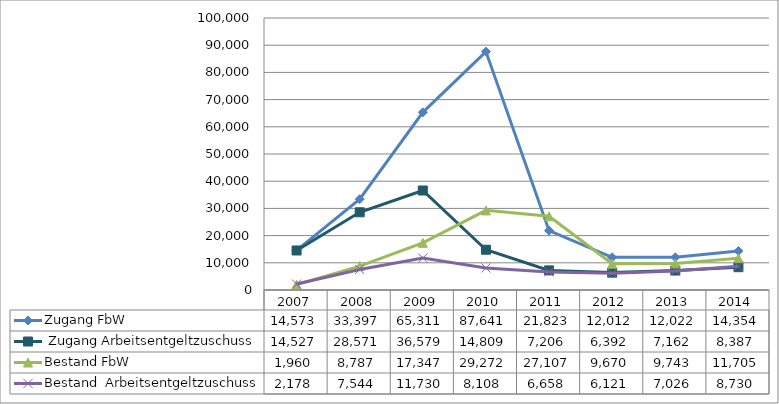
| Category | Zugang FbW |  Zugang Arbeitsentgeltzuschuss | Bestand FbW | Bestand  Arbeitsentgeltzuschuss |
|---|---|---|---|---|
| 2007.0 | 14573 | 14527 | 1960 | 2178 |
| 2008.0 | 33397 | 28571 | 8787 | 7544 |
| 2009.0 | 65311 | 36579 | 17347 | 11730 |
| 2010.0 | 87641 | 14809 | 29272 | 8108 |
| 2011.0 | 21823 | 7206 | 27107 | 6658 |
| 2012.0 | 12012 | 6392 | 9670 | 6121 |
| 2013.0 | 12022 | 7162 | 9743 | 7026 |
| 2014.0 | 14354 | 8387 | 11705 | 8730 |